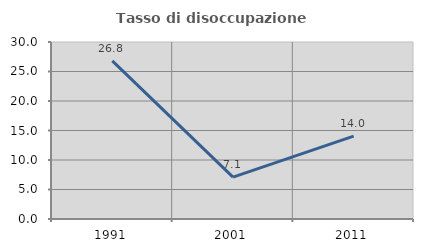
| Category | Tasso di disoccupazione giovanile  |
|---|---|
| 1991.0 | 26.8 |
| 2001.0 | 7.101 |
| 2011.0 | 14.035 |